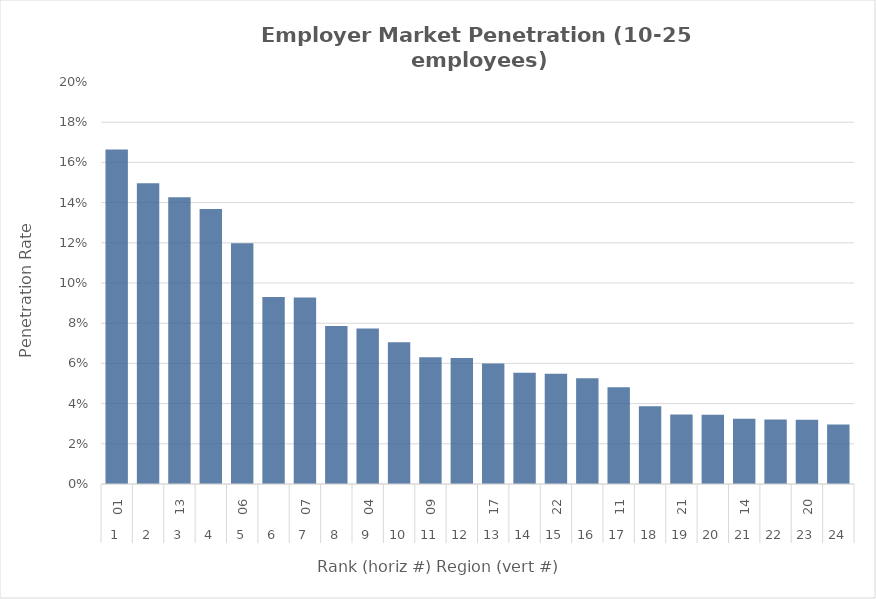
| Category | Rate |
|---|---|
| 0 | 0.166 |
| 1 | 0.15 |
| 2 | 0.143 |
| 3 | 0.137 |
| 4 | 0.12 |
| 5 | 0.093 |
| 6 | 0.093 |
| 7 | 0.079 |
| 8 | 0.077 |
| 9 | 0.071 |
| 10 | 0.063 |
| 11 | 0.063 |
| 12 | 0.06 |
| 13 | 0.055 |
| 14 | 0.055 |
| 15 | 0.053 |
| 16 | 0.048 |
| 17 | 0.039 |
| 18 | 0.035 |
| 19 | 0.035 |
| 20 | 0.032 |
| 21 | 0.032 |
| 22 | 0.032 |
| 23 | 0.03 |